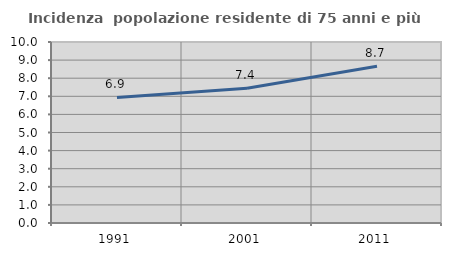
| Category | Incidenza  popolazione residente di 75 anni e più |
|---|---|
| 1991.0 | 6.934 |
| 2001.0 | 7.449 |
| 2011.0 | 8.666 |